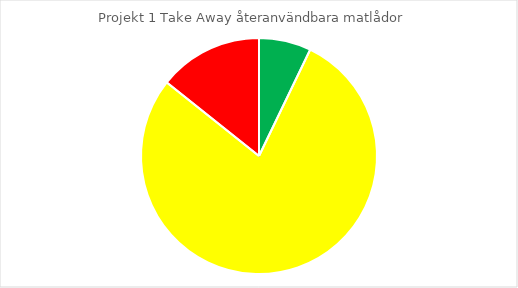
| Category | Series 0 |
|---|---|
| 0 | 1 |
| 1 | 11 |
| 2 | 2 |